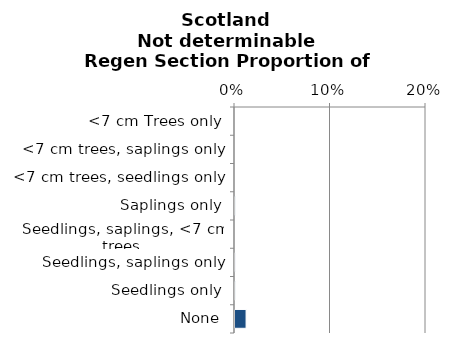
| Category | Not determinable |
|---|---|
| None | 0.012 |
| Seedlings only | 0 |
| Seedlings, saplings only | 0 |
| Seedlings, saplings, <7 cm trees | 0 |
| Saplings only | 0 |
| <7 cm trees, seedlings only | 0 |
| <7 cm trees, saplings only | 0 |
| <7 cm Trees only | 0 |